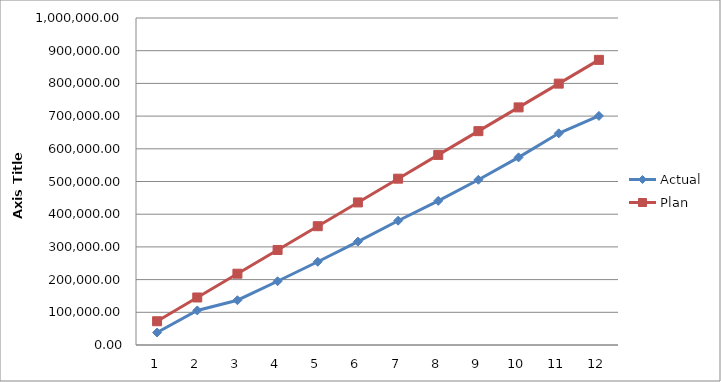
| Category | Actual | Plan |
|---|---|---|
| 0 | 38152.56 | 72663.5 |
| 1 | 105631.31 | 145327 |
| 2 | 136922.07 | 217990.5 |
| 3 | 194936.17 | 290654 |
| 4 | 254522.57 | 363317.5 |
| 5 | 316209.5 | 435981 |
| 6 | 380029.98 | 508644.5 |
| 7 | 440777.58 | 581308 |
| 8 | 505245.94 | 653971.5 |
| 9 | 573799.28 | 726635 |
| 10 | 647360.96 | 799298.5 |
| 11 | 700560.9 | 871962 |